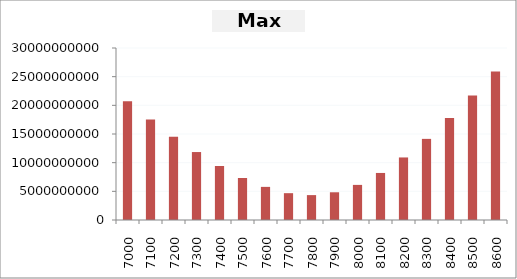
| Category | Series 0 |
|---|---|
| 7000.0 | 20691180000 |
| 7100.0 | 17538622500 |
| 7200.0 | 14522550000 |
| 7300.0 | 11852475000 |
| 7400.0 | 9422212500 |
| 7500.0 | 7322010000 |
| 7600.0 | 5776650000 |
| 7700.0 | 4678935000 |
| 7800.0 | 4341862500 |
| 7900.0 | 4836060000 |
| 8000.0 | 6122940000 |
| 8100.0 | 8205630000 |
| 8200.0 | 10909402500 |
| 8300.0 | 14149387500 |
| 8400.0 | 17809395000 |
| 8500.0 | 21708517500 |
| 8600.0 | 25881712500 |